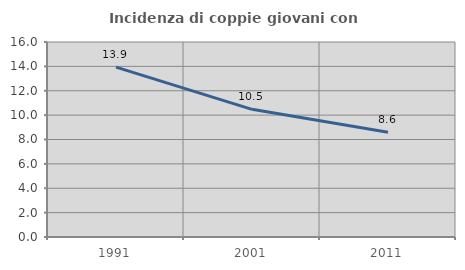
| Category | Incidenza di coppie giovani con figli |
|---|---|
| 1991.0 | 13.942 |
| 2001.0 | 10.476 |
| 2011.0 | 8.59 |